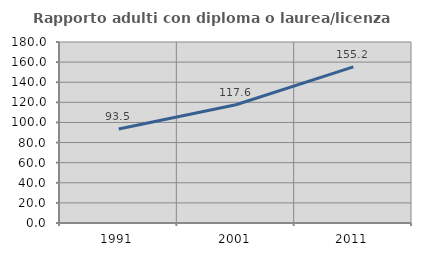
| Category | Rapporto adulti con diploma o laurea/licenza media  |
|---|---|
| 1991.0 | 93.539 |
| 2001.0 | 117.572 |
| 2011.0 | 155.215 |